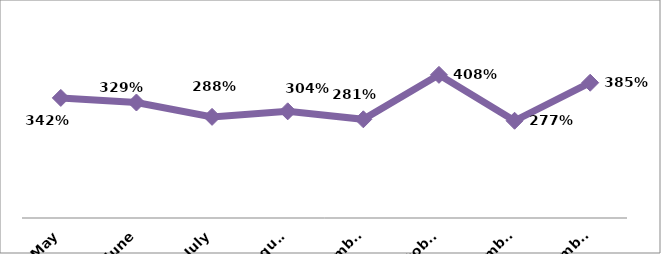
| Category | PERCENTAGE |
|---|---|
| May | 3.42 |
| June | 3.289 |
| July | 2.88 |
| August | 3.039 |
| September | 2.811 |
| October | 4.077 |
| November | 2.769 |
| December | 3.853 |